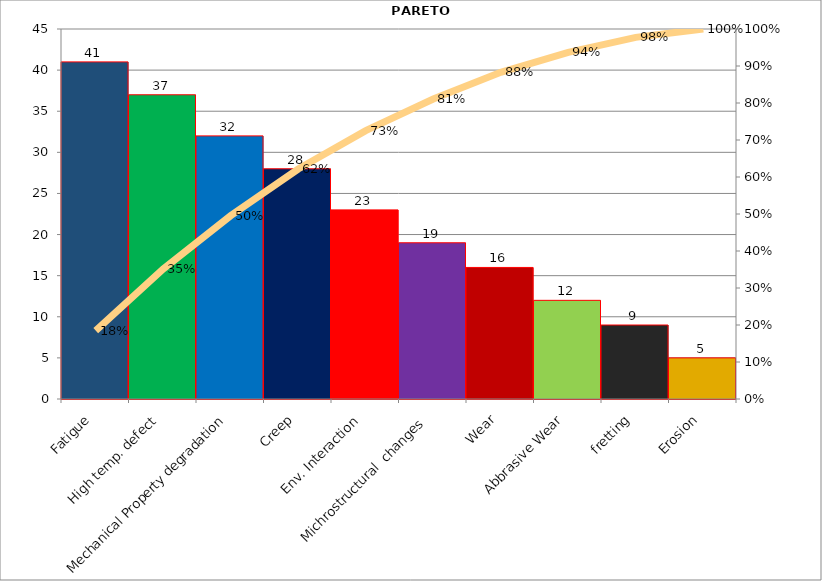
| Category | Quantity |
|---|---|
| Fatigue | 41 |
| High temp. defect | 37 |
| Mechanical Property degradation | 32 |
| Creep | 28 |
| Env. Interaction | 23 |
| Michrostructural  changes | 19 |
| Wear | 16 |
| Abbrasive Wear | 12 |
| fretting | 9 |
| Erosion | 5 |